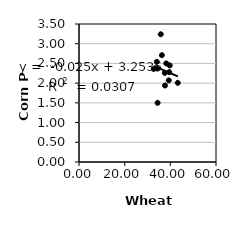
| Category | Series 0 |
|---|---|
| 34.42797621988373 | 1.5 |
| 37.674233622307625 | 1.94 |
| 34.07033276931754 | 2.54 |
| 32.74831966554108 | 2.36 |
| 39.49809468822171 | 2.28 |
| 34.33337954699063 | 2.37 |
| 39.30463185736365 | 2.07 |
| 38.21342007909172 | 2.5 |
| 37.57456694188117 | 2.26 |
| 35.812470260070555 | 3.24 |
| 36.31403054332798 | 2.71 |
| 39.740031772496344 | 2.45 |
| 43.2652760860739 | 2.007 |